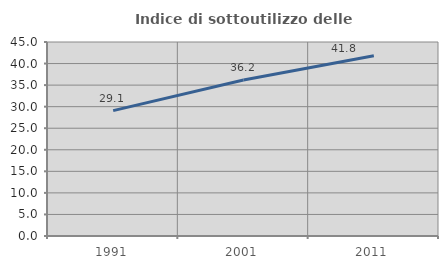
| Category | Indice di sottoutilizzo delle abitazioni  |
|---|---|
| 1991.0 | 29.077 |
| 2001.0 | 36.182 |
| 2011.0 | 41.805 |